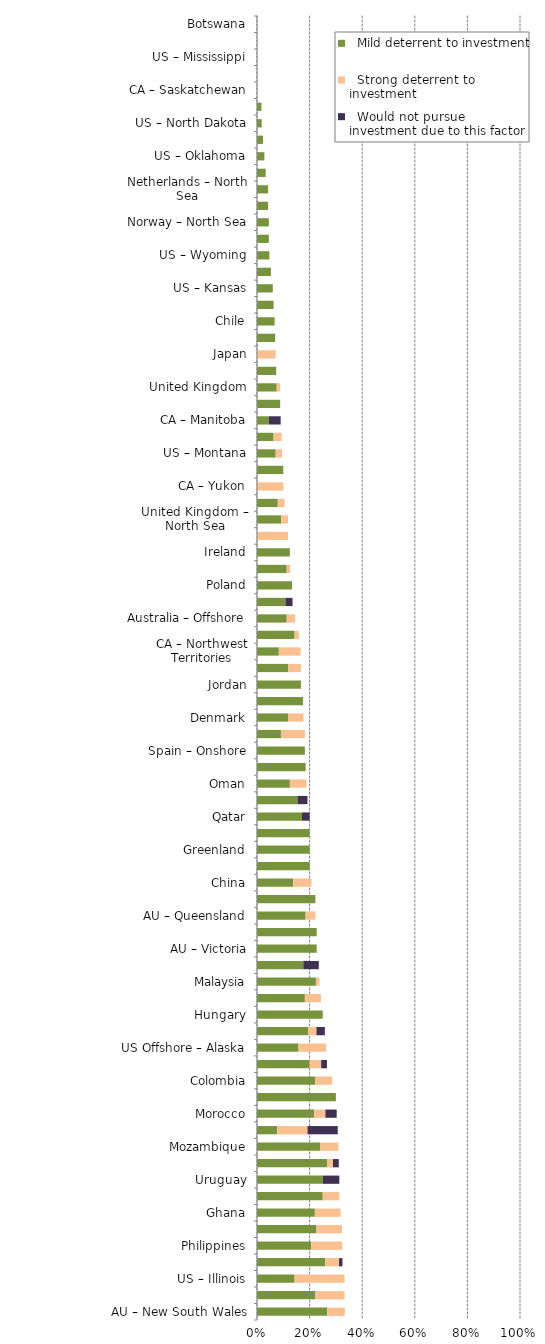
| Category |   Mild deterrent to investment |   Strong deterrent to investment |   Would not pursue investment due to this factor |
|---|---|---|---|
| AU – New South Wales | 0.267 | 0.067 | 0 |
| Mauritania | 0.222 | 0.111 | 0 |
| US – Illinois | 0.143 | 0.19 | 0 |
| CA – British Columbia | 0.26 | 0.052 | 0.013 |
| Philippines | 0.206 | 0.118 | 0 |
| Vietnam | 0.226 | 0.097 | 0 |
| Ghana | 0.22 | 0.098 | 0 |
| Israel | 0.25 | 0.063 | 0 |
| Uruguay | 0.25 | 0 | 0.063 |
| Brazil – Offshore concession contracts | 0.267 | 0.022 | 0.022 |
| Mozambique | 0.241 | 0.069 | 0 |
| US – New York | 0.077 | 0.115 | 0.115 |
| Morocco | 0.217 | 0.043 | 0.043 |
| Turkey | 0.3 | 0 | 0 |
| Colombia | 0.221 | 0.065 | 0 |
| Trinidad and Tobago | 0.2 | 0.044 | 0.022 |
| US Offshore – Alaska | 0.158 | 0.105 | 0 |
| Brazil – Onshore concession contracts | 0.194 | 0.032 | 0.032 |
| Hungary | 0.25 | 0 | 0 |
| Brazil – Offshore presalt area profit sharing contracts | 0.182 | 0.061 | 0 |
| Malaysia | 0.224 | 0.013 | 0 |
| Kuwait | 0.176 | 0 | 0.059 |
| AU – Victoria | 0.227 | 0 | 0 |
| Spain – Offshore | 0.227 | 0 | 0 |
| AU – Queensland | 0.185 | 0.037 | 0 |
| Faroe Islands | 0.222 | 0 | 0 |
| China | 0.138 | 0.069 | 0 |
| US – Alaska | 0.2 | 0 | 0 |
| Greenland | 0.2 | 0 | 0 |
| Namibia | 0.2 | 0 | 0 |
| Qatar | 0.171 | 0 | 0.029 |
| CA – Nova Scotia | 0.154 | 0 | 0.038 |
| Oman | 0.125 | 0.063 | 0 |
| CA – Newfoundland & Labrador | 0.185 | 0 | 0 |
| Spain – Onshore | 0.182 | 0 | 0 |
| Seychelles | 0.091 | 0.091 | 0 |
| Denmark | 0.118 | 0.059 | 0 |
| US – Pennsylvania | 0.175 | 0 | 0 |
| Jordan | 0.167 | 0 | 0 |
| US – New Mexico | 0.119 | 0.048 | 0 |
| CA – Northwest Territories | 0.083 | 0.083 | 0 |
| US Offshore – Gulf of Mexico | 0.143 | 0.016 | 0 |
| Australia – Offshore | 0.113 | 0.032 | 0 |
| United Arab Emirates | 0.108 | 0 | 0.027 |
| Poland | 0.133 | 0 | 0 |
| CA – Alberta | 0.113 | 0.013 | 0 |
| Ireland | 0.125 | 0 | 0 |
| Germany | 0 | 0.118 | 0 |
| United Kingdom – North Sea | 0.092 | 0.026 | 0 |
| New Zealand | 0.079 | 0.026 | 0 |
| CA – Yukon | 0 | 0.1 | 0 |
| AU – South Australia | 0.1 | 0 | 0 |
| US – Montana | 0.071 | 0.024 | 0 |
| US – Utah | 0.063 | 0.031 | 0 |
| CA – Manitoba | 0.045 | 0 | 0.045 |
| US – Louisiana | 0.088 | 0 | 0 |
| United Kingdom | 0.075 | 0.013 | 0 |
| AU – Western Australia | 0.073 | 0 | 0 |
| Japan | 0 | 0.071 | 0 |
| US – Arkansas | 0.069 | 0 | 0 |
| Chile | 0.067 | 0 | 0 |
| US – Ohio | 0.063 | 0 | 0 |
| US – Kansas | 0.06 | 0 | 0 |
| AU – Northern Territory | 0.053 | 0 | 0 |
| US – Wyoming | 0.047 | 0 | 0 |
| US – West Virginia | 0.045 | 0 | 0 |
| Norway – North Sea | 0.045 | 0 | 0 |
| Netherlands | 0.042 | 0 | 0 |
| Netherlands – North Sea | 0.042 | 0 | 0 |
| Brunei | 0.033 | 0 | 0 |
| US – Oklahoma | 0.028 | 0 | 0 |
| Norway | 0.023 | 0 | 0 |
| US – North Dakota | 0.018 | 0 | 0 |
| US – Texas | 0.017 | 0 | 0 |
| CA – Saskatchewan | 0 | 0 | 0 |
| US – Alabama | 0 | 0 | 0 |
| US – Mississippi | 0 | 0 | 0 |
| AU – Tasmania | 0 | 0 | 0 |
| Botswana | 0 | 0 | 0 |